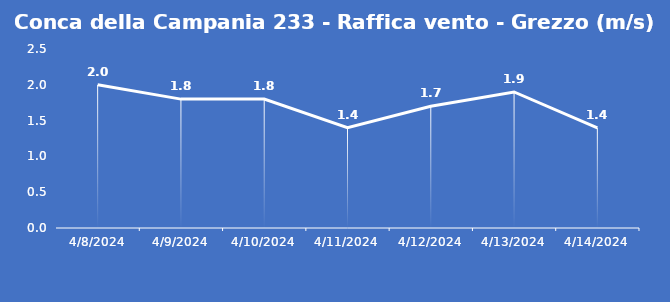
| Category | Conca della Campania 233 - Raffica vento - Grezzo (m/s) |
|---|---|
| 4/8/24 | 2 |
| 4/9/24 | 1.8 |
| 4/10/24 | 1.8 |
| 4/11/24 | 1.4 |
| 4/12/24 | 1.7 |
| 4/13/24 | 1.9 |
| 4/14/24 | 1.4 |